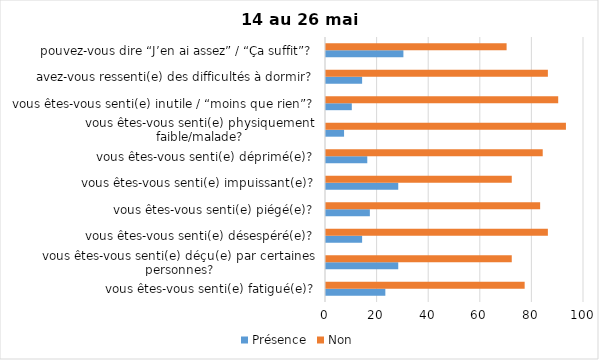
| Category | Présence | Non |
|---|---|---|
| vous êtes-vous senti(e) fatigué(e)? | 23 | 77 |
| vous êtes-vous senti(e) déçu(e) par certaines personnes? | 28 | 72 |
| vous êtes-vous senti(e) désespéré(e)? | 14 | 86 |
| vous êtes-vous senti(e) piégé(e)? | 17 | 83 |
| vous êtes-vous senti(e) impuissant(e)? | 28 | 72 |
| vous êtes-vous senti(e) déprimé(e)? | 16 | 84 |
| vous êtes-vous senti(e) physiquement faible/malade? | 7 | 93 |
| vous êtes-vous senti(e) inutile / “moins que rien”? | 10 | 90 |
| avez-vous ressenti(e) des difficultés à dormir? | 14 | 86 |
| pouvez-vous dire “J’en ai assez” / “Ça suffit”? | 30 | 70 |